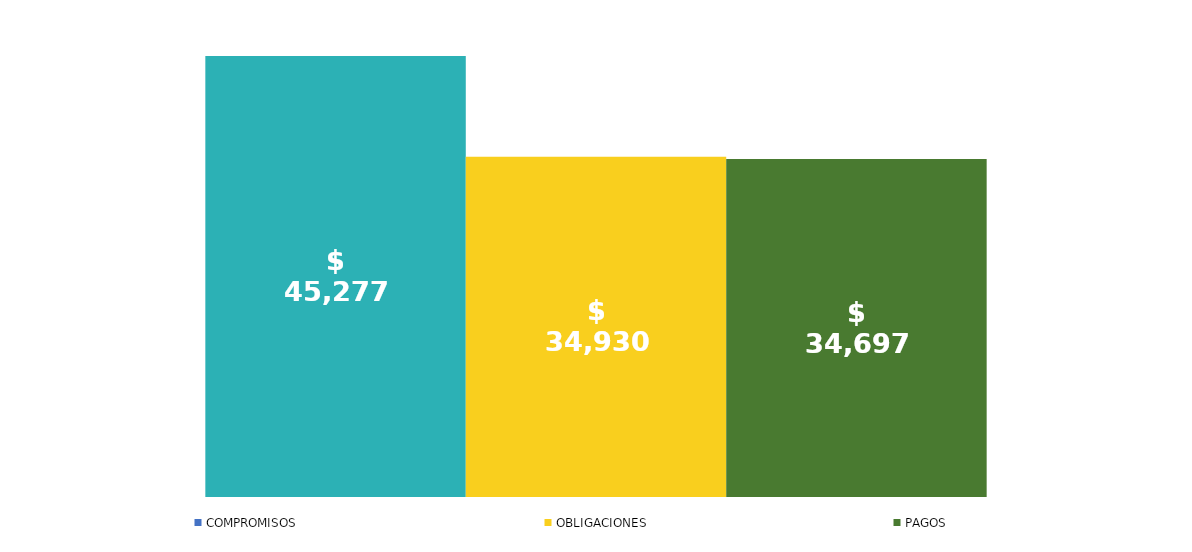
| Category | COMPROMISOS | OBLIGACIONES | PAGOS |
|---|---|---|---|
| Total | 45277370288.903 | 34930452650.562 | 34696611376.029 |